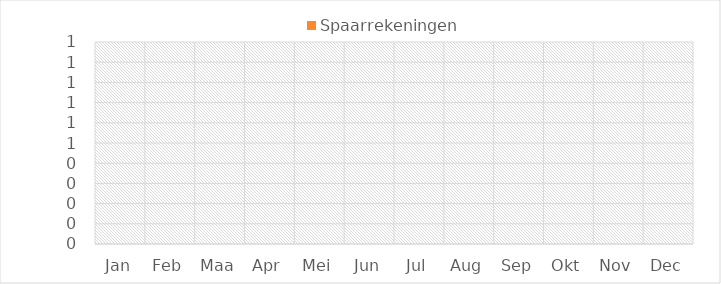
| Category | Spaarrekeningen |
|---|---|
| Jan | 0 |
| Feb | 0 |
| Maa | 0 |
| Apr | 0 |
| Mei | 0 |
| Jun | 0 |
| Jul | 0 |
| Aug | 0 |
| Sep | 0 |
| Okt | 0 |
| Nov | 0 |
| Dec | 0 |